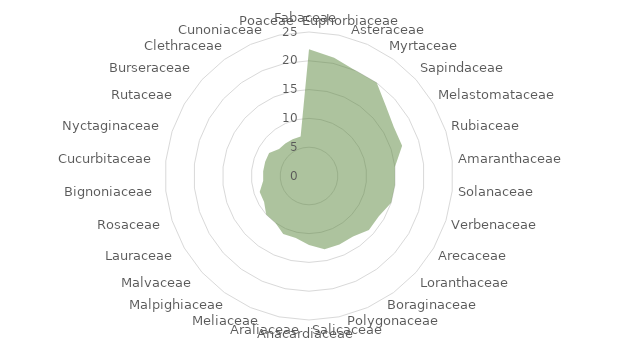
| Category | Series 0 |
|---|---|
| Fabaceae | 22 |
| Euphorbiaceae | 21 |
| Asteraceae | 20 |
| Myrtaceae | 20 |
| Sapindaceae | 18 |
| Melastomataceae | 17 |
| Rubiaceae | 17 |
| Amaranthaceae | 15 |
| Solanaceae | 15 |
| Verbenaceae | 15 |
| Arecaceae | 14 |
| Loranthaceae | 14 |
| Boraginaceae | 13 |
| Polygonaceae | 13 |
| Salicaceae | 13 |
| Anacardiaceae | 12 |
| Araliaceae | 11 |
| Meliaceae | 11 |
| Malpighiaceae | 10 |
| Malvaceae | 10 |
| Lauraceae | 9 |
| Rosaceae | 9 |
| Bignoniaceae | 8 |
| Cucurbitaceae | 8 |
| Nyctaginaceae | 8 |
| Rutaceae | 8 |
| Burseraceae | 7 |
| Clethraceae | 7 |
| Cunoniaceae | 7 |
| Poaceae | 7 |